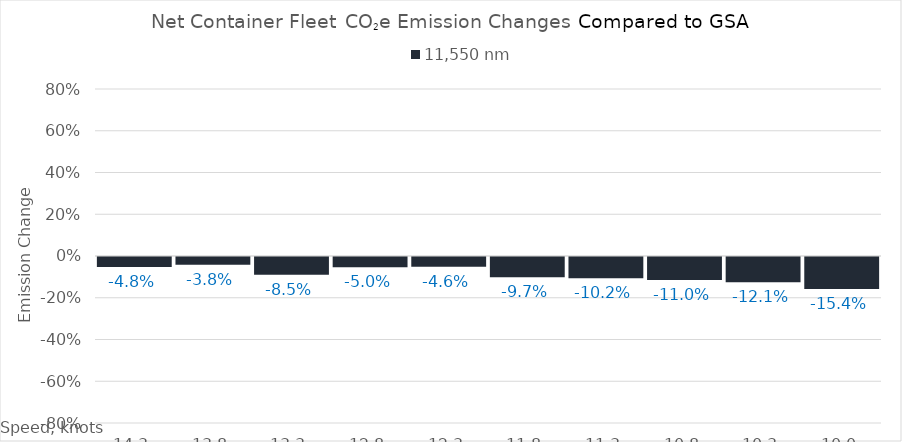
| Category | 11,550 |
|---|---|
| 14.3 | -0.048 |
| 13.8 | -0.038 |
| 13.3 | -0.085 |
| 12.8 | -0.05 |
| 12.3 | -0.046 |
| 11.8 | -0.097 |
| 11.3 | -0.102 |
| 10.8 | -0.11 |
| 10.3 | -0.121 |
| 10.0 | -0.154 |